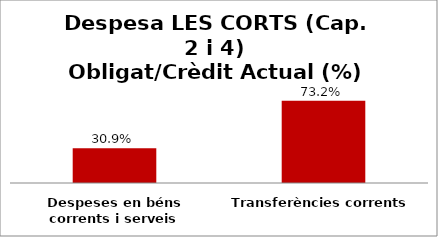
| Category | Series 0 |
|---|---|
| Despeses en béns corrents i serveis | 0.309 |
| Transferències corrents | 0.732 |